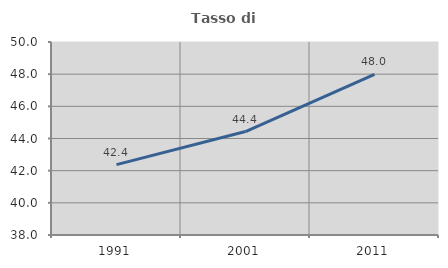
| Category | Tasso di occupazione   |
|---|---|
| 1991.0 | 42.374 |
| 2001.0 | 44.433 |
| 2011.0 | 47.99 |